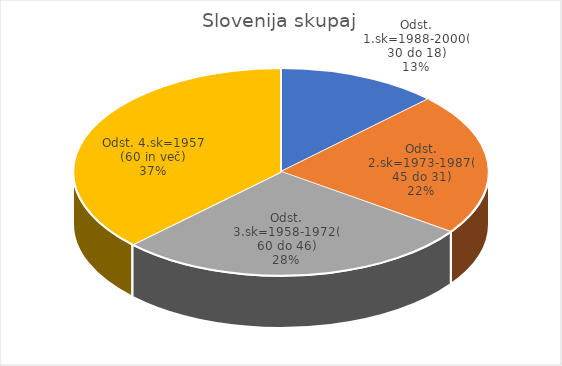
| Category | Slovenija skupaj |
|---|---|
| Odst. 1.sk=1988-2000(30 do 18) | 6.53 |
| Odst. 2.sk=1973-1987(45 do 31) | 11.53 |
| Odst. 3.sk=1958-1972(60 do 46) | 14.45 |
| Odst. 4.sk=1957 (60 in več) | 19.38 |